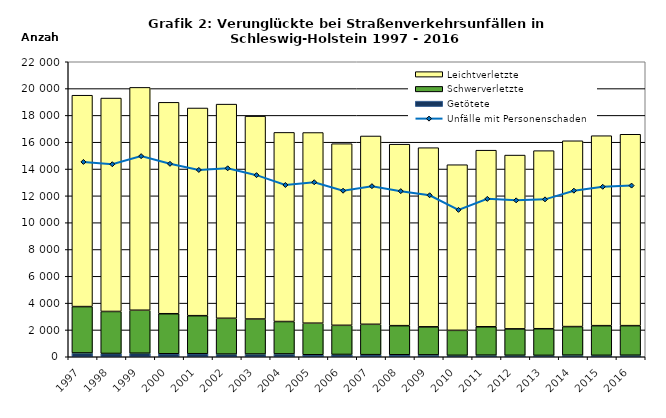
| Category | Getötete | Schwerverletzte | Leichtverletzte |
|---|---|---|---|
| 1997.0 | 282 | 3459 | 15764 |
| 1998.0 | 245 | 3132 | 15915 |
| 1999.0 | 264 | 3205 | 16619 |
| 2000.0 | 223 | 2985 | 15767 |
| 2001.0 | 226 | 2837 | 15488 |
| 2002.0 | 199 | 2670 | 15971 |
| 2003.0 | 204 | 2611 | 15128 |
| 2004.0 | 212 | 2415 | 14104 |
| 2005.0 | 148 | 2355 | 14219 |
| 2006.0 | 172 | 2173 | 13546 |
| 2007.0 | 156 | 2265 | 14043 |
| 2008.0 | 149 | 2169 | 13535 |
| 2009.0 | 140 | 2092 | 13360 |
| 2010.0 | 108 | 1862 | 12352 |
| 2011.0 | 120 | 2116 | 13169 |
| 2012.0 | 110 | 1970 | 12961 |
| 2013.0 | 103 | 1987 | 13280 |
| 2014.0 | 121 | 2128 | 13858 |
| 2015.0 | 107 | 2211 | 14167 |
| 2016.0 | 114 | 2205 | 14274 |